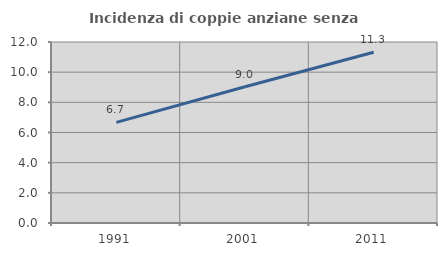
| Category | Incidenza di coppie anziane senza figli  |
|---|---|
| 1991.0 | 6.668 |
| 2001.0 | 9.029 |
| 2011.0 | 11.323 |